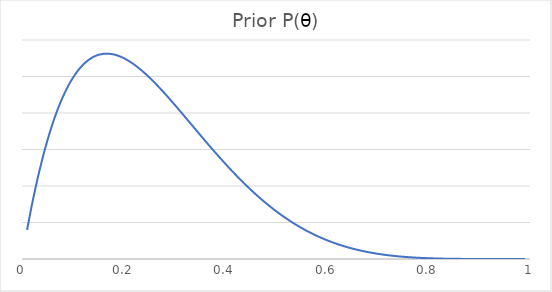
| Category | Series 0 |
|---|---|
| 0.01 | 0.399 |
| 0.02 | 0.759 |
| 0.03 | 1.082 |
| 0.04 | 1.37 |
| 0.05 | 1.625 |
| 0.06 | 1.849 |
| 0.07 | 2.045 |
| 0.08 | 2.215 |
| 0.09 | 2.359 |
| 0.1 | 2.48 |
| 0.11 | 2.58 |
| 0.12 | 2.66 |
| 0.13 | 2.721 |
| 0.14 | 2.766 |
| 0.15 | 2.795 |
| 0.16 | 2.81 |
| 0.17 | 2.812 |
| 0.18 | 2.803 |
| 0.19 | 2.782 |
| 0.2 | 2.753 |
| 0.21 | 2.714 |
| 0.22 | 2.668 |
| 0.23 | 2.615 |
| 0.24 | 2.556 |
| 0.25 | 2.492 |
| 0.26 | 2.423 |
| 0.27 | 2.351 |
| 0.28 | 2.275 |
| 0.29 | 2.198 |
| 0.3 | 2.118 |
| 0.31 | 2.036 |
| 0.32 | 1.954 |
| 0.33 | 1.871 |
| 0.34 | 1.788 |
| 0.35 | 1.706 |
| 0.36 | 1.623 |
| 0.37 | 1.542 |
| 0.38 | 1.462 |
| 0.39 | 1.383 |
| 0.4 | 1.306 |
| 0.41 | 1.231 |
| 0.42 | 1.158 |
| 0.43 | 1.087 |
| 0.44 | 1.018 |
| 0.45 | 0.951 |
| 0.46 | 0.887 |
| 0.47 | 0.826 |
| 0.48 | 0.766 |
| 0.49 | 0.71 |
| 0.5 | 0.656 |
| 0.51 | 0.605 |
| 0.52 | 0.556 |
| 0.53 | 0.511 |
| 0.54 | 0.467 |
| 0.55 | 0.426 |
| 0.56 | 0.388 |
| 0.57 | 0.352 |
| 0.58 | 0.318 |
| 0.59 | 0.287 |
| 0.6 | 0.258 |
| 0.61 | 0.231 |
| 0.62 | 0.206 |
| 0.63 | 0.183 |
| 0.64 | 0.163 |
| 0.65 | 0.143 |
| 0.66 | 0.126 |
| 0.67 | 0.11 |
| 0.68 | 0.096 |
| 0.69 | 0.083 |
| 0.7 | 0.071 |
| 0.71 | 0.061 |
| 0.72 | 0.052 |
| 0.73 | 0.044 |
| 0.74 | 0.037 |
| 0.75 | 0.031 |
| 0.76 | 0.025 |
| 0.77 | 0.021 |
| 0.78 | 0.017 |
| 0.79 | 0.014 |
| 0.8 | 0.011 |
| 0.81 | 0.008 |
| 0.82 | 0.007 |
| 0.83 | 0.005 |
| 0.84 | 0.004 |
| 0.85 | 0.003 |
| 0.86 | 0.002 |
| 0.87 | 0.001 |
| 0.88 | 0.001 |
| 0.89 | 0.001 |
| 0.9 | 0 |
| 0.91 | 0 |
| 0.92 | 0 |
| 0.93 | 0 |
| 0.94 | 0 |
| 0.95 | 0 |
| 0.96 | 0 |
| 0.97 | 0 |
| 0.98 | 0 |
| 0.99 | 0 |